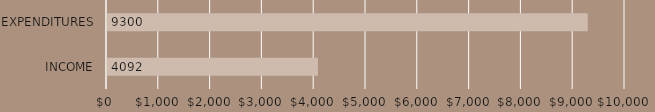
| Category | MONTH TOTALS |
|---|---|
| INCOME | 4092 |
| EXPENDITURES | 9300 |